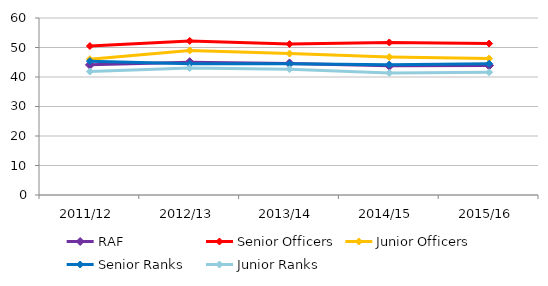
| Category | RAF | Senior Officers | Junior Officers | Senior Ranks | Junior Ranks |
|---|---|---|---|---|---|
| 2011/12 | 44.114 | 50.495 | 46.034 | 45.378 | 41.864 |
| 2012/13 | 45.039 | 52.242 | 49.017 | 44.481 | 43.061 |
| 2013/14 | 44.609 | 51.161 | 47.949 | 44.48 | 42.656 |
| 2014/15 | 43.826 | 51.711 | 46.761 | 44.187 | 41.39 |
| 2015/16 | 43.935 | 51.331 | 46.234 | 44.513 | 41.592 |